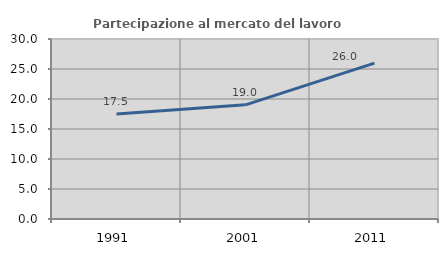
| Category | Partecipazione al mercato del lavoro  femminile |
|---|---|
| 1991.0 | 17.509 |
| 2001.0 | 19.028 |
| 2011.0 | 25.987 |